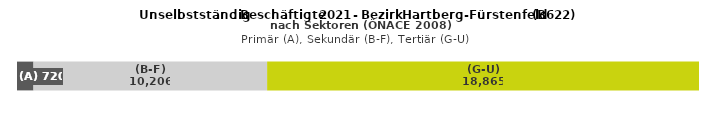
| Category | (A) | (B-F) | (G-U) |
|---|---|---|---|
| 0 | 720 | 10206 | 18865 |